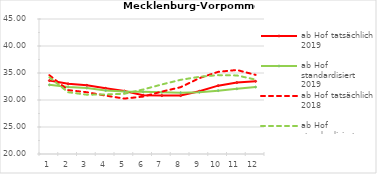
| Category | ab Hof tatsächlich 2019 | ab Hof standardisiert 2019 | ab Hof tatsächlich 2018 | ab Hof standardisiert 2018 |
|---|---|---|---|---|
| 0 | 33.595 | 32.803 | 34.594 | 34.2 |
| 1 | 32.995 | 32.425 | 31.83 | 31.441 |
| 2 | 32.723 | 32.215 | 31.438 | 30.98 |
| 3 | 32.156 | 31.756 | 30.808 | 31.023 |
| 4 | 31.654 | 31.553 | 30.261 | 31.158 |
| 5 | 30.88 | 31.505 | 30.634 | 31.946 |
| 6 | 30.818 | 31.447 | 31.559 | 32.882 |
| 7 | 30.816 | 31.35 | 32.37 | 33.735 |
| 8 | 31.612 | 31.444 | 34.051 | 34.292 |
| 9 | 32.655 | 31.724 | 35.21 | 34.607 |
| 10 | 33.226 | 32.067 | 35.559 | 34.553 |
| 11 | 33.463 | 32.394 | 34.648 | 33.774 |